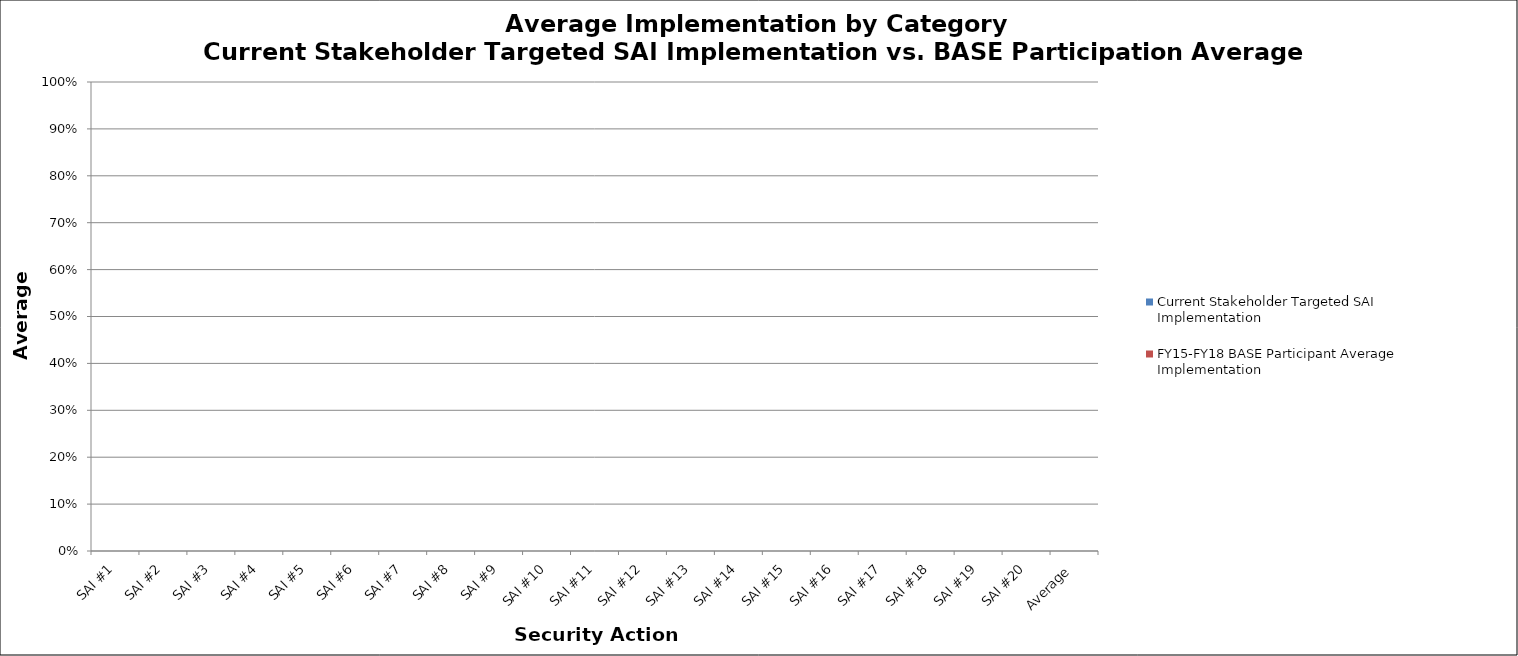
| Category | Current Stakeholder Targeted SAI Implementation | FY15-FY18 BASE Participant Average Implementation |
|---|---|---|
| SAI #1 | 0 | 0 |
| SAI #2 | 0 | 0 |
| SAI #3 | 0 | 0 |
| SAI #4 | 0 | 0 |
| SAI #5 | 0 | 0 |
| SAI #6 | 0 | 0 |
| SAI #7 | 0 | 0 |
| SAI #8 | 0 | 0 |
| SAI #9 | 0 | 0 |
| SAI #10 | 0 | 0 |
| SAI #11 | 0 | 0 |
| SAI #12 | 0 | 0 |
| SAI #13 | 0 | 0 |
| SAI #14 | 0 | 0 |
| SAI #15 | 0 | 0 |
| SAI #16 | 0 | 0 |
| SAI #17 | 0 | 0 |
| SAI #18 | 0 | 0 |
| SAI #19 | 0 | 0 |
| SAI #20 | 0 | 0 |
| Average | 0 | 0 |